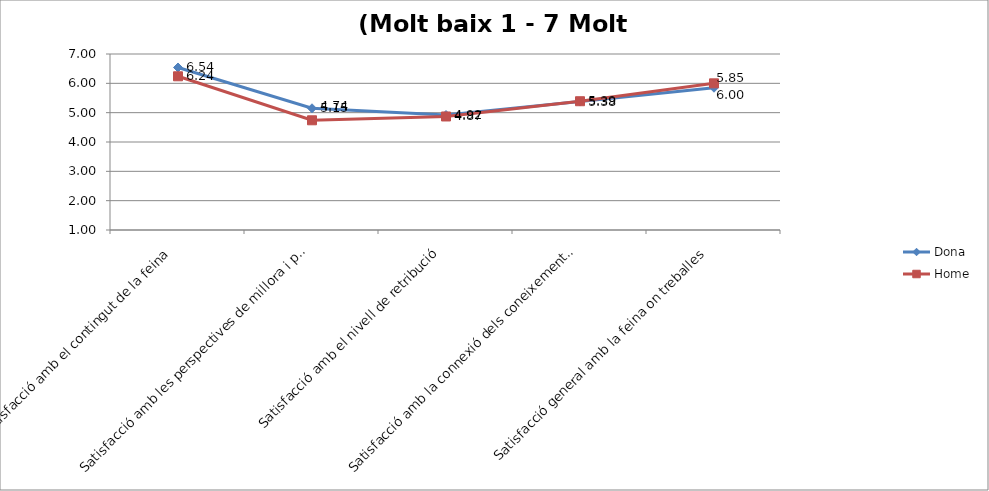
| Category | Dona | Home |
|---|---|---|
| Satisfacció amb el contingut de la feina | 6.54 | 6.24 |
| Satisfacció amb les perspectives de millora i promoció | 5.15 | 4.74 |
| Satisfacció amb el nivell de retribució | 4.92 | 4.87 |
| Satisfacció amb la connexió dels coneixements/competències desenvolupades de la formació doctoral i la feina | 5.38 | 5.39 |
| Satisfacció general amb la feina on treballes | 5.85 | 6 |